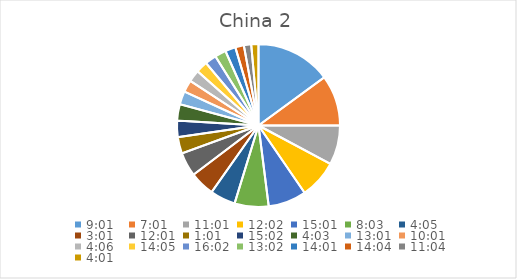
| Category | Series 0 |
|---|---|
| 0.3756944444444445 | 15.212 |
| 0.2923611111111111 | 10.231 |
| 0.4590277777777778 | 7.982 |
| 0.5013888888888889 | 7.767 |
| 0.6256944444444444 | 7.696 |
| 0.3354166666666667 | 6.869 |
| 0.17013888888888887 | 5.115 |
| 0.12569444444444444 | 5.025 |
| 0.5006944444444444 | 4.844 |
| 0.042361111111111106 | 3.331 |
| 0.6263888888888889 | 3.309 |
| 0.16874999999999998 | 3.309 |
| 0.5423611111111112 | 2.656 |
| 0.4173611111111111 | 2.44 |
| 0.1708333333333333 | 2.397 |
| 0.5868055555555556 | 2.354 |
| 0.6680555555555556 | 2.289 |
| 0.5430555555555555 | 2.268 |
| 0.5840277777777778 | 2.096 |
| 0.5861111111111111 | 1.734 |
| 0.4611111111111111 | 1.479 |
| 0.1673611111111111 | 1.458 |